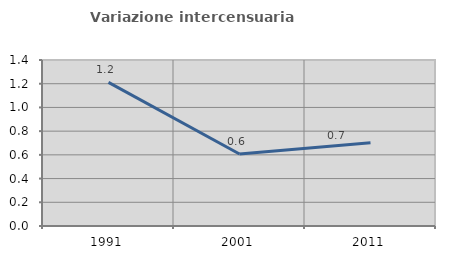
| Category | Variazione intercensuaria annua |
|---|---|
| 1991.0 | 1.212 |
| 2001.0 | 0.607 |
| 2011.0 | 0.702 |